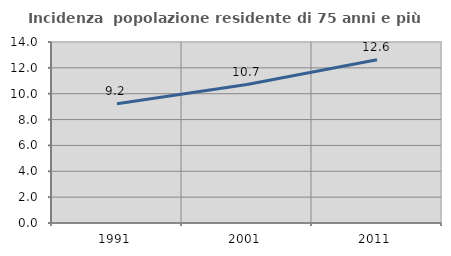
| Category | Incidenza  popolazione residente di 75 anni e più |
|---|---|
| 1991.0 | 9.232 |
| 2001.0 | 10.712 |
| 2011.0 | 12.624 |